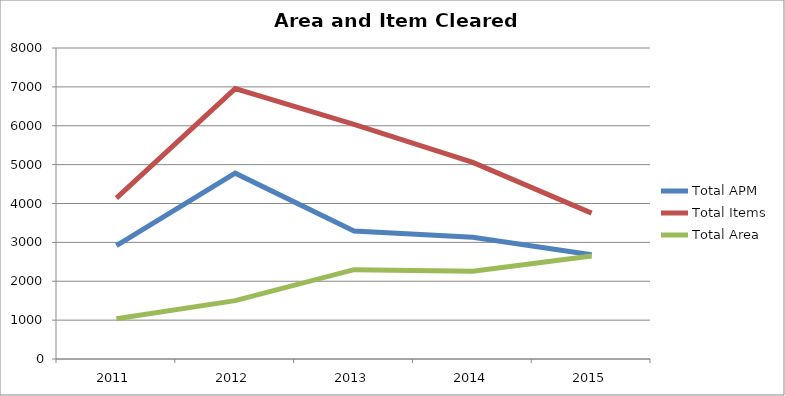
| Category | Total APM | Total Items | Total Area |
|---|---|---|---|
| 2011.0 | 2916 | 4138 | 1035 |
| 2012.0 | 4781 | 6957 | 1501 |
| 2013.0 | 3295 | 6037 | 2298 |
| 2014.0 | 3132 | 5058 | 2257 |
| 2015.0 | 2684 | 3752 | 2649.333 |